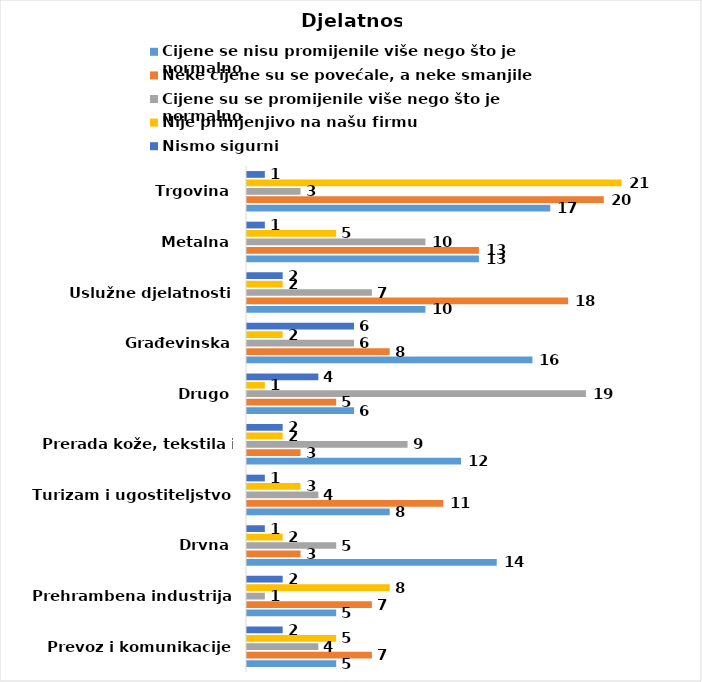
| Category | Cijene se nisu promijenile više nego što je normalno | Neke cijene su se povećale, a neke smanjile | Cijene su se promijenile više nego što je normalno | Nije primjenjivo na našu firmu | Nismo sigurni |
|---|---|---|---|---|---|
| Prevoz i komunikacije | 5 | 7 | 4 | 5 | 2 |
| Prehrambena industrija | 5 | 7 | 1 | 8 | 2 |
| Drvna | 14 | 3 | 5 | 2 | 1 |
| Turizam i ugostiteljstvo | 8 | 11 | 4 | 3 | 1 |
| Prerada kože, tekstila i obuće | 12 | 3 | 9 | 2 | 2 |
| Drugo | 6 | 5 | 19 | 1 | 4 |
| Građevinska | 16 | 8 | 6 | 2 | 6 |
| Uslužne djelatnosti | 10 | 18 | 7 | 2 | 2 |
| Metalna | 13 | 13 | 10 | 5 | 1 |
| Trgovina | 17 | 20 | 3 | 21 | 1 |